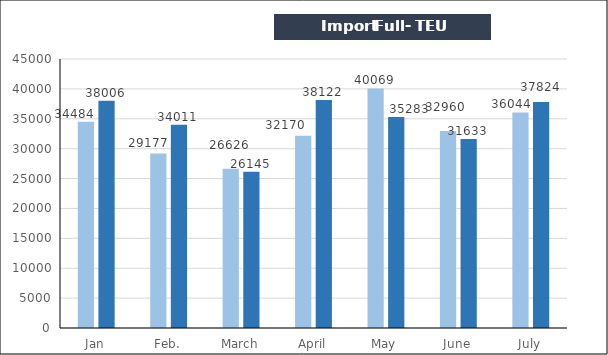
| Category | TEU |
|---|---|
| Jan | 38006 |
| Feb. | 34011 |
| March | 26145 |
| April | 38122 |
| May | 35283 |
| June | 31633 |
| July | 37824 |